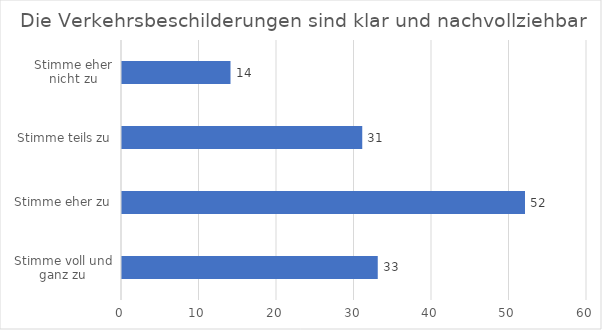
| Category | Series 0 |
|---|---|
| Stimme voll und ganz zu | 33 |
| Stimme eher zu | 52 |
| Stimme teils zu | 31 |
| Stimme eher nicht zu | 14 |